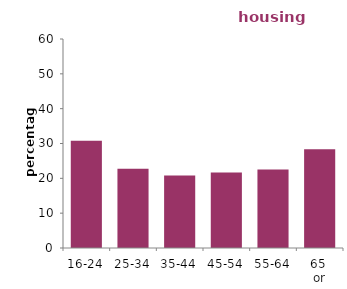
| Category | housing association |
|---|---|
| 16-24 | 30.818 |
| 25-34 | 22.758 |
| 35-44 | 20.802 |
| 45-54 | 21.651 |
| 55-64 | 22.564 |
| 65 
or over | 28.381 |